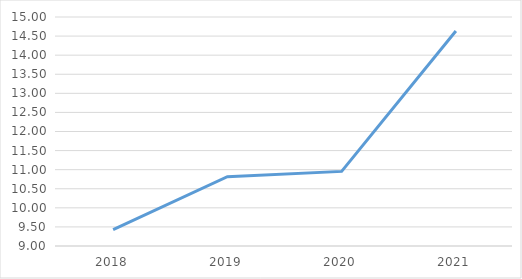
| Category | Series 0 |
|---|---|
| 2018.0 | 9.428 |
| 2019.0 | 10.816 |
| 2020.0 | 10.955 |
| 2021.0 | 14.635 |